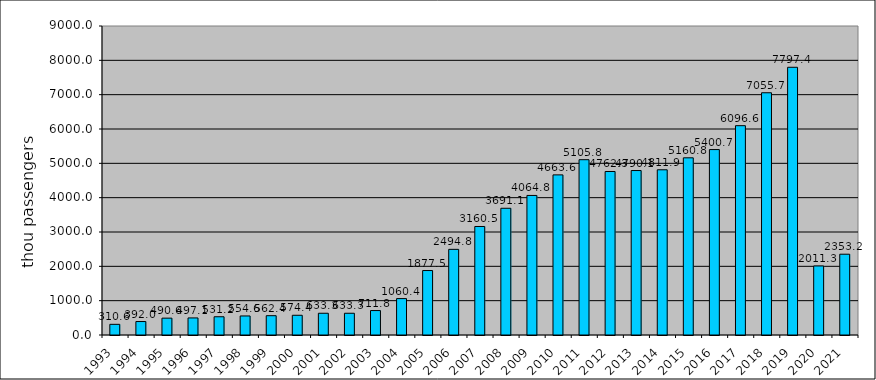
| Category | Series 0 |
|---|---|
| 1993.0 | 310.6 |
| 1994.0 | 392 |
| 1995.0 | 490.62 |
| 1996.0 | 497.13 |
| 1997.0 | 531.22 |
| 1998.0 | 554.62 |
| 1999.0 | 562.383 |
| 2000.0 | 574.356 |
| 2001.0 | 633.319 |
| 2002.0 | 633.319 |
| 2003.0 | 711.848 |
| 2004.0 | 1060.384 |
| 2005.0 | 1877.461 |
| 2006.0 | 2494.835 |
| 2007.0 | 3160.535 |
| 2008.0 | 3691.099 |
| 2009.0 | 4064.755 |
| 2010.0 | 4663.647 |
| 2011.0 | 5105.818 |
| 2012.0 | 4762.335 |
| 2013.0 | 4790.136 |
| 2014.0 | 4811.949 |
| 2015.0 | 5160.759 |
| 2016.0 | 5400.709 |
| 2017.0 | 6096.62 |
| 2018.0 | 7055.734 |
| 2019.0 | 7797.398 |
| 2020.0 | 2011.274 |
| 2021.0 | 2353.246 |